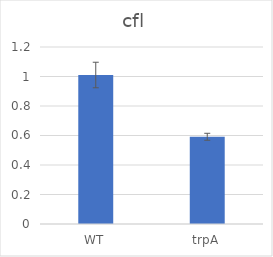
| Category | Series 0 |
|---|---|
| WT | 1.01 |
| trpA | 0.591 |